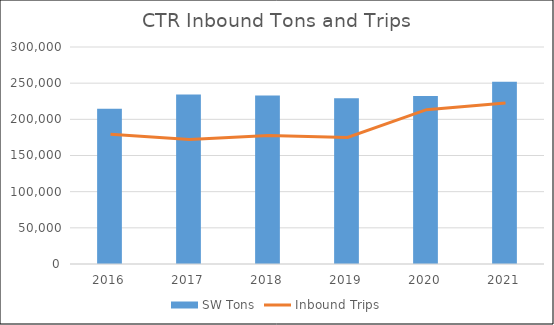
| Category | SW Tons |
|---|---|
| 2016.0 | 214570 |
| 2017.0 | 234254 |
| 2018.0 | 233044 |
| 2019.0 | 229036 |
| 2020.0 | 232426 |
| 2021.0 | 251847.16 |